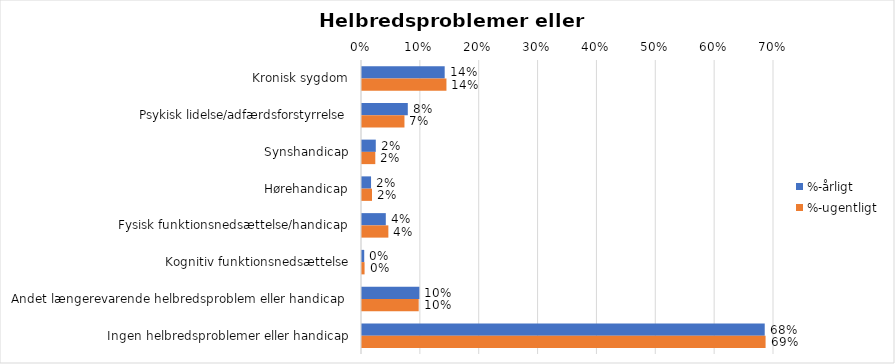
| Category | %-årligt | %-ugentligt |
|---|---|---|
| Kronisk sygdom | 0.14 | 0.143 |
| Psykisk lidelse/adfærdsforstyrrelse | 0.078 | 0.072 |
| Synshandicap | 0.023 | 0.023 |
| Hørehandicap | 0.015 | 0.017 |
| Fysisk funktionsnedsættelse/handicap | 0.04 | 0.045 |
| Kognitiv funktionsnedsættelse | 0.004 | 0.004 |
| Andet længerevarende helbredsproblem eller handicap  | 0.097 | 0.096 |
| Ingen helbredsproblemer eller handicap | 0.684 | 0.686 |